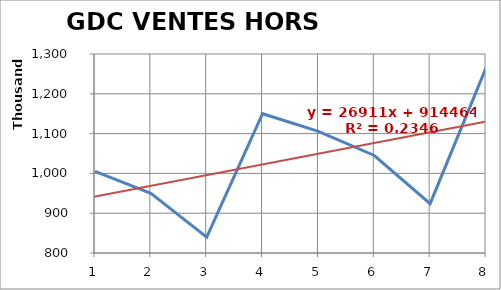
| Category | Ventes en Q |
|---|---|
| 1.0 | 1005000 |
| 2.0 | 950000 |
| 3.0 | 840000 |
| 4.0 | 1150000 |
| 5.0 | 1105500 |
| 6.0 | 1045000 |
| 7.0 | 924000 |
| 8.0 | 1265000 |